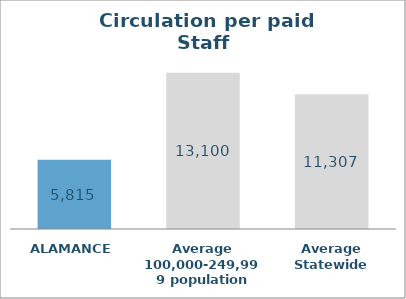
| Category | Series 0 |
|---|---|
| ALAMANCE | 5814.723 |
| Average 100,000-249,999 population | 13100.169 |
| Average Statewide | 11306.862 |